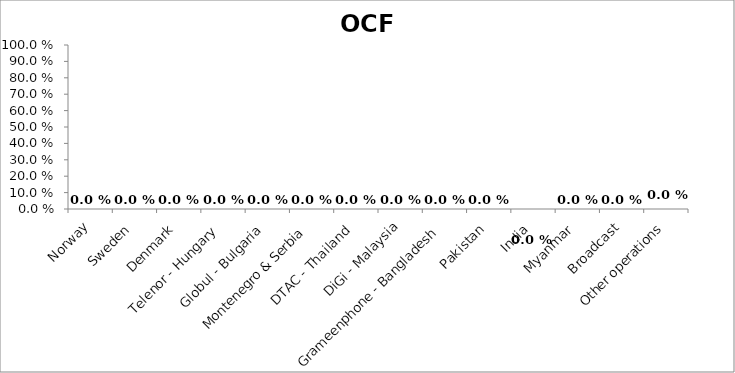
| Category | Series 0 |
|---|---|
| Norway | 0 |
| Sweden | 0 |
| Denmark | 0 |
| Telenor - Hungary | 0 |
| Globul - Bulgaria | 0 |
| Montenegro & Serbia | 0 |
| DTAC - Thailand | 0 |
| DiGi - Malaysia | 0 |
| Grameenphone - Bangladesh | 0 |
| Pakistan | 0 |
| India | 0 |
| Myanmar | 0 |
| Broadcast | 0 |
| Other operations | 0 |